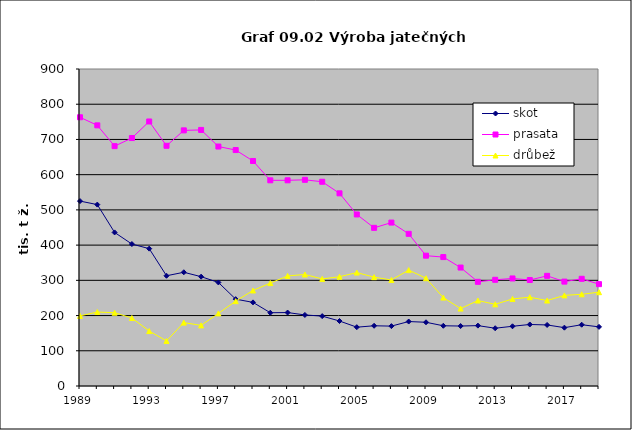
| Category | skot | prasata | drůbež |
|---|---|---|---|
| 1989.0 | 525 | 763 | 199 |
| 1990.0 | 515 | 740 | 210 |
| 1991.0 | 436 | 681 | 208 |
| 1992.0 | 403 | 704 | 193 |
| 1993.0 | 390 | 751 | 156 |
| 1994.0 | 313 | 682 | 128 |
| 1995.0 | 322.88 | 725.786 | 179.954 |
| 1996.0 | 310.426 | 727 | 172.064 |
| 1997.0 | 294 | 679.878 | 206.145 |
| 1998.0 | 246.585 | 669.905 | 240.887 |
| 1999.0 | 237.378 | 638.814 | 271.162 |
| 2000.0 | 208.04 | 583.929 | 292.289 |
| 2001.0 | 208.524 | 584.004 | 312.484 |
| 2002.0 | 201.744 | 585.374 | 316.582 |
| 2003.0 | 198.417 | 579.868 | 303.979 |
| 2004.0 | 184.531 | 547.009 | 310.225 |
| 2005.0 | 167 | 487 | 322 |
| 2006.0 | 171 | 449 | 309 |
| 2007.0 | 170 | 464 | 301 |
| 2008.0 | 183 | 432 | 329 |
| 2009.0 | 180.912 | 370 | 306 |
| 2010.0 | 171 | 366 | 251 |
| 2011.0 | 170.253 | 336.258 | 219.789 |
| 2012.0 | 171.426 | 295.791 | 242.568 |
| 2013.0 | 164.043 | 301.542 | 231.898 |
| 2014.0 | 169.588 | 305.306 | 247.215 |
| 2015.0 | 174.694 | 300.883 | 252.081 |
| 2016.0 | 173.342 | 312.739 | 242.624 |
| 2017.0 | 165.65 | 296.375 | 257.263 |
| 2018.0 | 173.982 | 304.356 | 260.375 |
| 2019.0 | 167.902 | 289.164 | 266.343 |